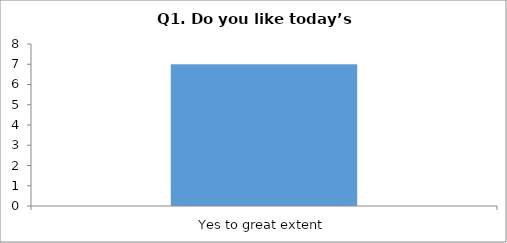
| Category | Q1. Do you like today’s session? |
|---|---|
| Yes to great extent | 7 |